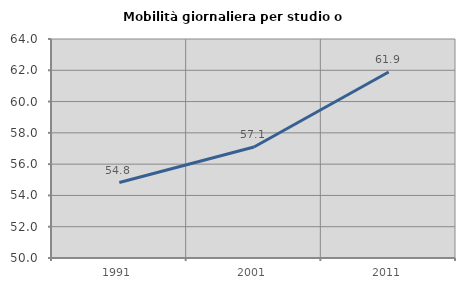
| Category | Mobilità giornaliera per studio o lavoro |
|---|---|
| 1991.0 | 54.824 |
| 2001.0 | 57.092 |
| 2011.0 | 61.887 |